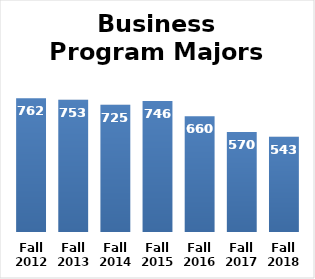
| Category | Series 0 |
|---|---|
| Fall 2012 | 762 |
| Fall 2013 | 753 |
| Fall 2014 | 725 |
| Fall 2015 | 746 |
| Fall 2016 | 660 |
| Fall 2017 | 570 |
| Fall 2018 | 543 |